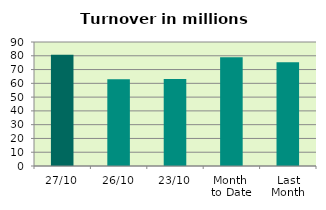
| Category | Series 0 |
|---|---|
| 27/10 | 80.752 |
| 26/10 | 63.054 |
| 23/10 | 63.116 |
| Month 
to Date | 78.869 |
| Last
Month | 75.235 |